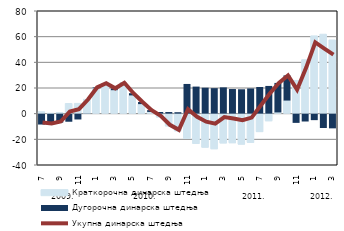
| Category | Краткорочна динарска штедња | Дугорочна динарска штедња |
|---|---|---|
| 0 | 1.517 | -8.462 |
| 1900-01-01 | -0.083 | -7.553 |
| 1900-01-02 | 0.873 | -7.006 |
| 1900-01-03 | 7.888 | -6.291 |
| 1900-01-04 | 7.991 | -4.514 |
| 1900-01-05 | 11.207 | -0.168 |
| 1900-01-06 | 19.762 | 0.644 |
| 1900-01-07 | 22.351 | 1.314 |
| 1900-01-08 | 18.277 | 1.469 |
| 1900-01-09 | 22.204 | 1.88 |
| 1900-01-10 | 14.225 | 1.731 |
| 1900-01-11 | 7.43 | 1.648 |
| 1900-01-12 | 1.349 | 1.39 |
| 1900-01-13 | -2.943 | 1.29 |
| 1900-01-14 | -9.928 | 1.269 |
| 1900-01-15 | -13.728 | 1.122 |
| 1900-01-16 | -19.65 | 23.156 |
| 1900-01-17 | -23.596 | 21.103 |
| 1900-01-18 | -26.491 | 20.227 |
| 1900-01-19 | -27.706 | 19.889 |
| 1900-01-20 | -23.188 | 20.495 |
| 1900-01-21 | -23.028 | 19.195 |
| 1900-01-22 | -24.112 | 19.009 |
| 1900-01-23 | -22.72 | 19.651 |
| 1900-01-24 | -14.353 | 20.764 |
| 1900-01-25 | -5.904 | 21.609 |
| 1900-01-26 | 0.976 | 22.98 |
| 1900-01-27 | 10.204 | 19.609 |
| 1900-01-28 | 25.864 | -7.177 |
| 1900-01-29 | 42.018 | -6.103 |
| 1900-01-30 | 60.579 | -5.042 |
| 1900-01-31 | 61.872 | -11.163 |
| 1900-02-01 | 57.389 | -11.438 |